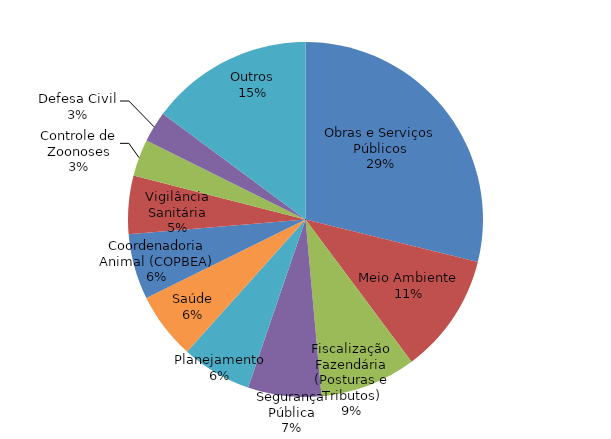
| Category | Quantidade |
|---|---|
| Obras e Serviços Públicos | 12038 |
| Meio Ambiente | 4570 |
| Fiscalização Fazendária (Posturas e Tributos) | 3652 |
| Segurança Pública | 2788 |
| Planejamento | 2665 |
| Saúde | 2531 |
| Coordenadoria Animal (COPBEA) | 2489 |
| Vigilância Sanitária | 2217 |
| Controle de Zoonoses | 1398 |
| Defesa Civil | 1174 |
| Outros | 6197 |